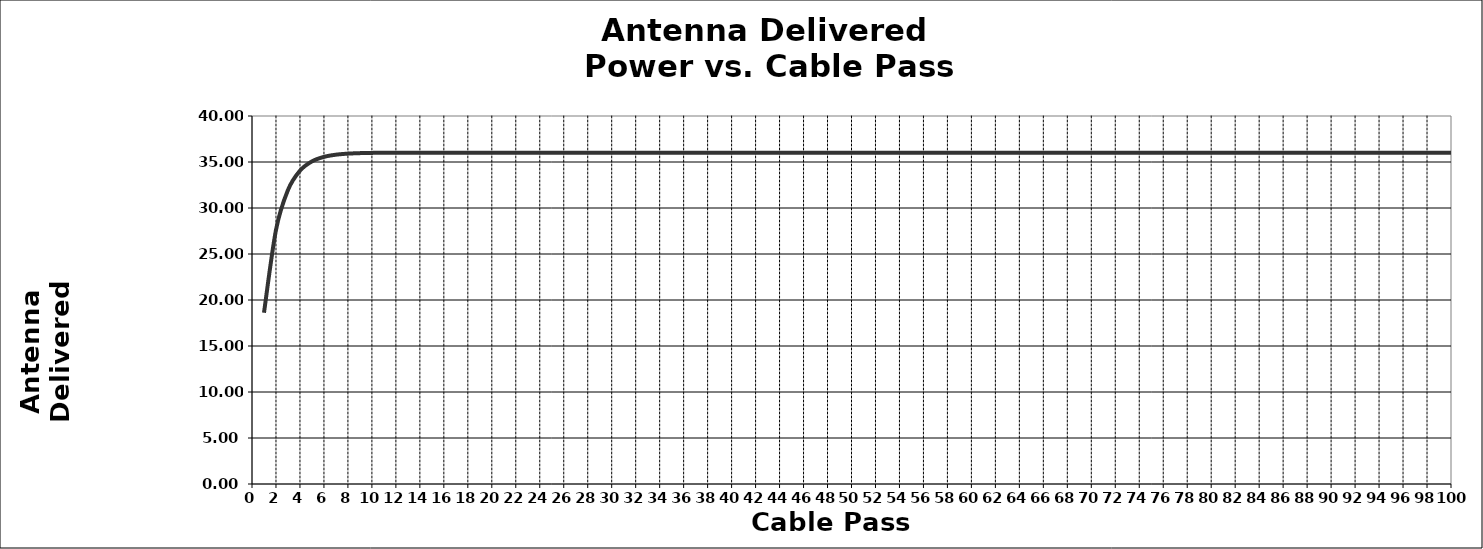
| Category | Series 0 |
|---|---|
| 1.0 | 18.617 |
| 2.0 | 27.611 |
| 3.0 | 31.955 |
| 4.0 | 34.054 |
| 5.0 | 35.068 |
| 6.0 | 35.557 |
| 7.0 | 35.794 |
| 8.0 | 35.908 |
| 9.0 | 35.964 |
| 10.0 | 35.99 |
| 11.0 | 36.003 |
| 12.0 | 36.009 |
| 13.0 | 36.012 |
| 14.0 | 36.014 |
| 15.0 | 36.014 |
| 16.0 | 36.015 |
| 17.0 | 36.015 |
| 18.0 | 36.015 |
| 19.0 | 36.015 |
| 20.0 | 36.015 |
| 21.0 | 36.015 |
| 22.0 | 36.015 |
| 23.0 | 36.015 |
| 24.0 | 36.015 |
| 25.0 | 36.015 |
| 26.0 | 36.015 |
| 27.0 | 36.015 |
| 28.0 | 36.015 |
| 29.0 | 36.015 |
| 30.0 | 36.015 |
| 31.0 | 36.015 |
| 32.0 | 36.015 |
| 33.0 | 36.015 |
| 34.0 | 36.015 |
| 35.0 | 36.015 |
| 36.0 | 36.015 |
| 37.0 | 36.015 |
| 38.0 | 36.015 |
| 39.0 | 36.015 |
| 40.0 | 36.015 |
| 41.0 | 36.015 |
| 42.0 | 36.015 |
| 43.0 | 36.015 |
| 44.0 | 36.015 |
| 45.0 | 36.015 |
| 46.0 | 36.015 |
| 47.0 | 36.015 |
| 48.0 | 36.015 |
| 49.0 | 36.015 |
| 50.0 | 36.015 |
| 51.0 | 36.015 |
| 52.0 | 36.015 |
| 53.0 | 36.015 |
| 54.0 | 36.015 |
| 55.0 | 36.015 |
| 56.0 | 36.015 |
| 57.0 | 36.015 |
| 58.0 | 36.015 |
| 59.0 | 36.015 |
| 60.0 | 36.015 |
| 61.0 | 36.015 |
| 62.0 | 36.015 |
| 63.0 | 36.015 |
| 64.0 | 36.015 |
| 65.0 | 36.015 |
| 66.0 | 36.015 |
| 67.0 | 36.015 |
| 68.0 | 36.015 |
| 69.0 | 36.015 |
| 70.0 | 36.015 |
| 71.0 | 36.015 |
| 72.0 | 36.015 |
| 73.0 | 36.015 |
| 74.0 | 36.015 |
| 75.0 | 36.015 |
| 76.0 | 36.015 |
| 77.0 | 36.015 |
| 78.0 | 36.015 |
| 79.0 | 36.015 |
| 80.0 | 36.015 |
| 81.0 | 36.015 |
| 82.0 | 36.015 |
| 83.0 | 36.015 |
| 84.0 | 36.015 |
| 85.0 | 36.015 |
| 86.0 | 36.015 |
| 87.0 | 36.015 |
| 88.0 | 36.015 |
| 89.0 | 36.015 |
| 90.0 | 36.015 |
| 91.0 | 36.015 |
| 92.0 | 36.015 |
| 93.0 | 36.015 |
| 94.0 | 36.015 |
| 95.0 | 36.015 |
| 96.0 | 36.015 |
| 97.0 | 36.015 |
| 98.0 | 36.015 |
| 99.0 | 36.015 |
| 100.0 | 36.015 |
| 101.0 | 36.015 |
| 102.0 | 36.015 |
| 103.0 | 36.015 |
| 104.0 | 36.015 |
| 105.0 | 36.015 |
| 106.0 | 36.015 |
| 107.0 | 36.015 |
| 108.0 | 36.015 |
| 109.0 | 36.015 |
| 110.0 | 36.015 |
| 111.0 | 36.015 |
| 112.0 | 36.015 |
| 113.0 | 36.015 |
| 114.0 | 36.015 |
| 115.0 | 36.015 |
| 116.0 | 36.015 |
| 117.0 | 36.015 |
| 118.0 | 36.015 |
| 119.0 | 36.015 |
| 120.0 | 36.015 |
| 121.0 | 36.015 |
| 122.0 | 36.015 |
| 123.0 | 36.015 |
| 124.0 | 36.015 |
| 125.0 | 36.015 |
| 126.0 | 36.015 |
| 127.0 | 36.015 |
| 128.0 | 36.015 |
| 129.0 | 36.015 |
| 130.0 | 36.015 |
| 131.0 | 36.015 |
| 132.0 | 36.015 |
| 133.0 | 36.015 |
| 134.0 | 36.015 |
| 135.0 | 36.015 |
| 136.0 | 36.015 |
| 137.0 | 36.015 |
| 138.0 | 36.015 |
| 139.0 | 36.015 |
| 140.0 | 36.015 |
| 141.0 | 36.015 |
| 142.0 | 36.015 |
| 143.0 | 36.015 |
| 144.0 | 36.015 |
| 145.0 | 36.015 |
| 146.0 | 36.015 |
| 147.0 | 36.015 |
| 148.0 | 36.015 |
| 149.0 | 36.015 |
| 150.0 | 36.015 |
| 151.0 | 36.015 |
| 152.0 | 36.015 |
| 153.0 | 36.015 |
| 154.0 | 36.015 |
| 155.0 | 36.015 |
| 156.0 | 36.015 |
| 157.0 | 36.015 |
| 158.0 | 36.015 |
| 159.0 | 36.015 |
| 160.0 | 36.015 |
| 161.0 | 36.015 |
| 162.0 | 36.015 |
| 163.0 | 36.015 |
| 164.0 | 36.015 |
| 165.0 | 36.015 |
| 166.0 | 36.015 |
| 167.0 | 36.015 |
| 168.0 | 36.015 |
| 169.0 | 36.015 |
| 170.0 | 36.015 |
| 171.0 | 36.015 |
| 172.0 | 36.015 |
| 173.0 | 36.015 |
| 174.0 | 36.015 |
| 175.0 | 36.015 |
| 176.0 | 36.015 |
| 177.0 | 36.015 |
| 178.0 | 36.015 |
| 179.0 | 36.015 |
| 180.0 | 36.015 |
| 181.0 | 36.015 |
| 182.0 | 36.015 |
| 183.0 | 36.015 |
| 184.0 | 36.015 |
| 185.0 | 36.015 |
| 186.0 | 36.015 |
| 187.0 | 36.015 |
| 188.0 | 36.015 |
| 189.0 | 36.015 |
| 190.0 | 36.015 |
| 191.0 | 36.015 |
| 192.0 | 36.015 |
| 193.0 | 36.015 |
| 194.0 | 36.015 |
| 195.0 | 36.015 |
| 196.0 | 36.015 |
| 197.0 | 36.015 |
| 198.0 | 36.015 |
| 199.0 | 36.015 |
| 200.0 | 36.015 |
| 201.0 | 36.015 |
| 202.0 | 36.015 |
| 203.0 | 36.015 |
| 204.0 | 36.015 |
| 205.0 | 36.015 |
| 206.0 | 36.015 |
| 207.0 | 36.015 |
| 208.0 | 36.015 |
| 209.0 | 36.015 |
| 210.0 | 36.015 |
| 211.0 | 36.015 |
| 212.0 | 36.015 |
| 213.0 | 36.015 |
| 214.0 | 36.015 |
| 215.0 | 36.015 |
| 216.0 | 36.015 |
| 217.0 | 36.015 |
| 218.0 | 36.015 |
| 219.0 | 36.015 |
| 220.0 | 36.015 |
| 221.0 | 36.015 |
| 222.0 | 36.015 |
| 223.0 | 36.015 |
| 224.0 | 36.015 |
| 225.0 | 36.015 |
| 226.0 | 36.015 |
| 227.0 | 36.015 |